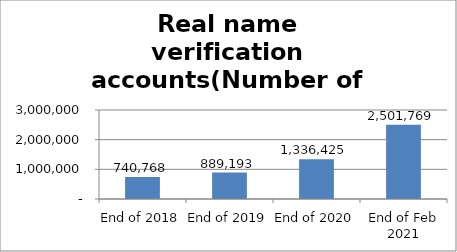
| Category | Real name verification accounts(Number of Accounts) |
|---|---|
| End of 2018 | 740768 |
| End of 2019 | 889193 |
| End of 2020 | 1336425 |
| End of Feb 2021 | 2501769 |